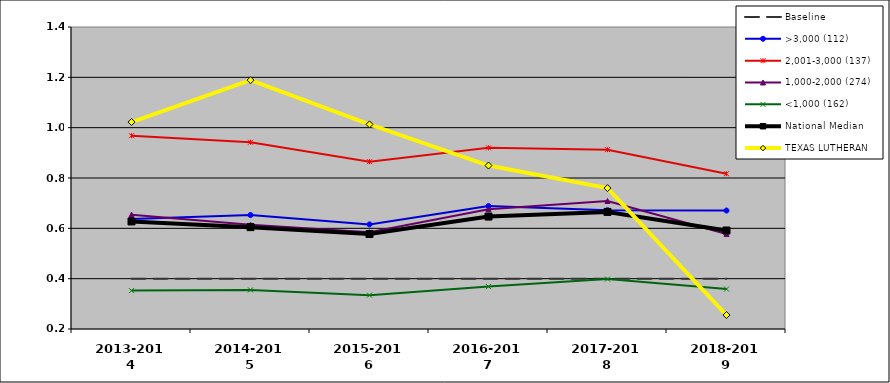
| Category |  Baseline  | >3,000 (112) | 2,001-3,000 (137) | 1,000-2,000 (274) | <1,000 (162) | National Median | TEXAS LUTHERAN |
|---|---|---|---|---|---|---|---|
| 2013-2014 | 0.4 | 0.637 | 0.968 | 0.654 | 0.353 | 0.627 | 1.022 |
| 2014-2015 | 0.4 | 0.653 | 0.942 | 0.614 | 0.355 | 0.605 | 1.189 |
| 2015-2016 | 0.4 | 0.616 | 0.865 | 0.584 | 0.335 | 0.577 | 1.013 |
| 2016-2017 | 0.4 | 0.688 | 0.92 | 0.676 | 0.369 | 0.647 | 0.849 |
| 2017-2018 | 0.4 | 0.672 | 0.913 | 0.709 | 0.398 | 0.665 | 0.76 |
| 2018-2019 | 0.4 | 0.671 | 0.817 | 0.577 | 0.359 | 0.591 | 0.255 |